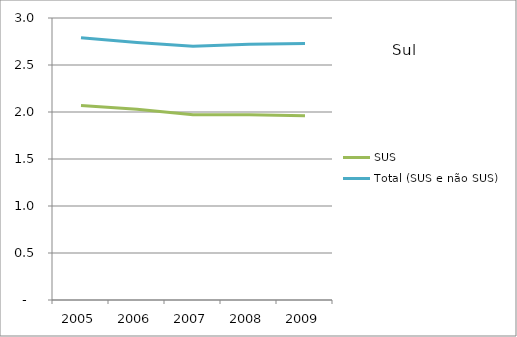
| Category | SUS | Total (SUS e não SUS) |
|---|---|---|
| 2005.0 | 2.07 | 2.79 |
| 2006.0 | 2.03 | 2.74 |
| 2007.0 | 1.97 | 2.7 |
| 2008.0 | 1.97 | 2.72 |
| 2009.0 | 1.96 | 2.73 |